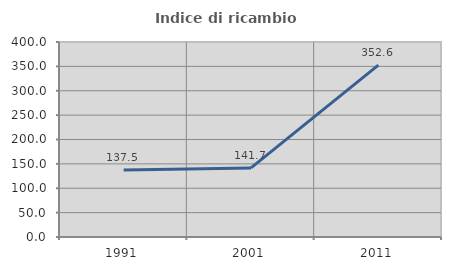
| Category | Indice di ricambio occupazionale  |
|---|---|
| 1991.0 | 137.5 |
| 2001.0 | 141.667 |
| 2011.0 | 352.632 |